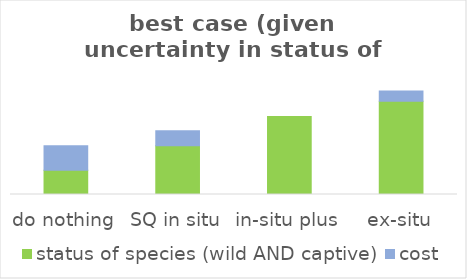
| Category | status of species (wild AND captive) | cost |
|---|---|---|
| do nothing | 0.199 | 0.2 |
| SQ in situ | 0.4 | 0.123 |
| in-situ plus | 0.64 | 0 |
| ex-situ | 0.764 | 0.084 |